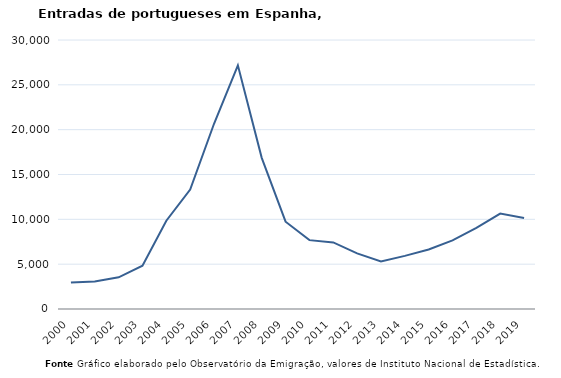
| Category | Entradas |
|---|---|
| 2000.0 | 2968 |
| 2001.0 | 3057 |
| 2002.0 | 3538 |
| 2003.0 | 4825 |
| 2004.0 | 9851 |
| 2005.0 | 13327 |
| 2006.0 | 20658 |
| 2007.0 | 27178 |
| 2008.0 | 16857 |
| 2009.0 | 9739 |
| 2010.0 | 7678 |
| 2011.0 | 7424 |
| 2012.0 | 6201 |
| 2013.0 | 5302 |
| 2014.0 | 5923 |
| 2015.0 | 6638 |
| 2016.0 | 7646 |
| 2017.0 | 9038 |
| 2018.0 | 10636 |
| 2019.0 | 10155 |